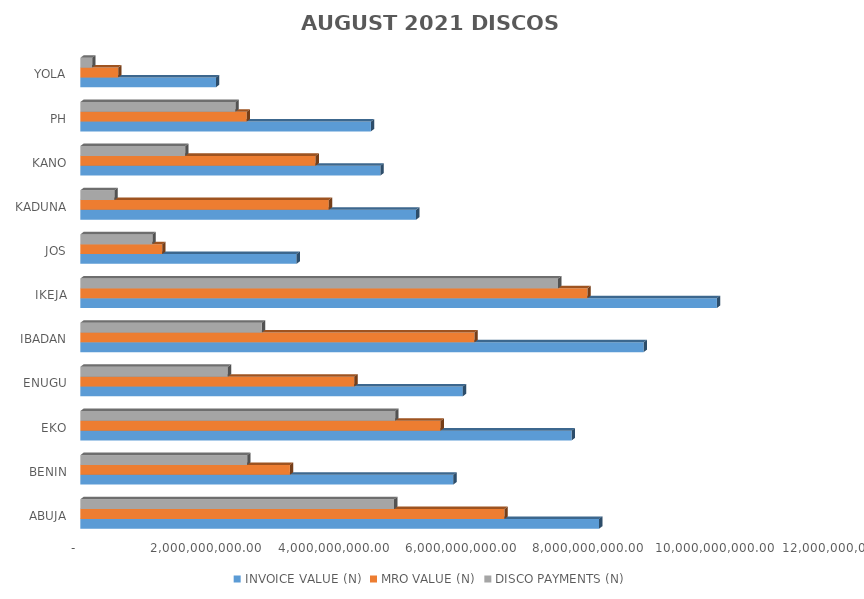
| Category | INVOICE VALUE (N) | MRO VALUE (N) | DISCO PAYMENTS (N) |
|---|---|---|---|
| ABUJA | 8157788193.771 | 6670623406.046 | 4934405628.58 |
| BENIN | 5866393834.121 | 3296326695.392 | 2623342821.37 |
| EKO | 7726985295.172 | 5666198316.95 | 4952224875.68 |
| ENUGU | 6015868224.759 | 4309166409.395 | 2319408675.35 |
| IBADAN | 8860201163.231 | 6198596733.796 | 2855256270.44 |
| IKEJA | 10011640939.595 | 7975273172.481 | 7513736525.17 |
| JOS | 3401080409.088 | 1288329258.963 | 1133239992.31 |
| KADUNA | 5280315408.631 | 3907433402.387 | 537473066.02 |
| KANO | 4720260570.659 | 3699740235.283 | 1649440405.47 |
| PH | 4569955623.695 | 2617213585.69 | 2438985316.37 |
| YOLA | 2133608596.345 | 595916880.959 | 186669805.55 |